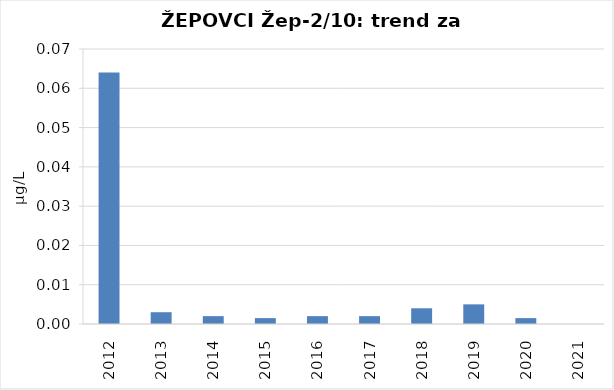
| Category | Vsota |
|---|---|
| 2012 | 0.064 |
| 2013 | 0.003 |
| 2014 | 0.002 |
| 2015 | 0.002 |
| 2016 | 0.002 |
| 2017 | 0.002 |
| 2018 | 0.004 |
| 2019 | 0.005 |
| 2020 | 0.002 |
| 2021 | 0 |